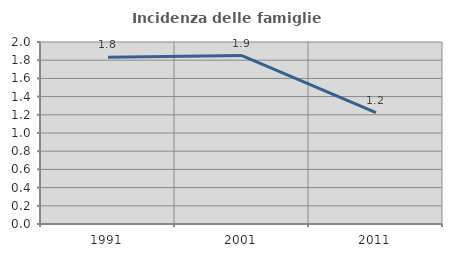
| Category | Incidenza delle famiglie numerose |
|---|---|
| 1991.0 | 1.832 |
| 2001.0 | 1.851 |
| 2011.0 | 1.224 |